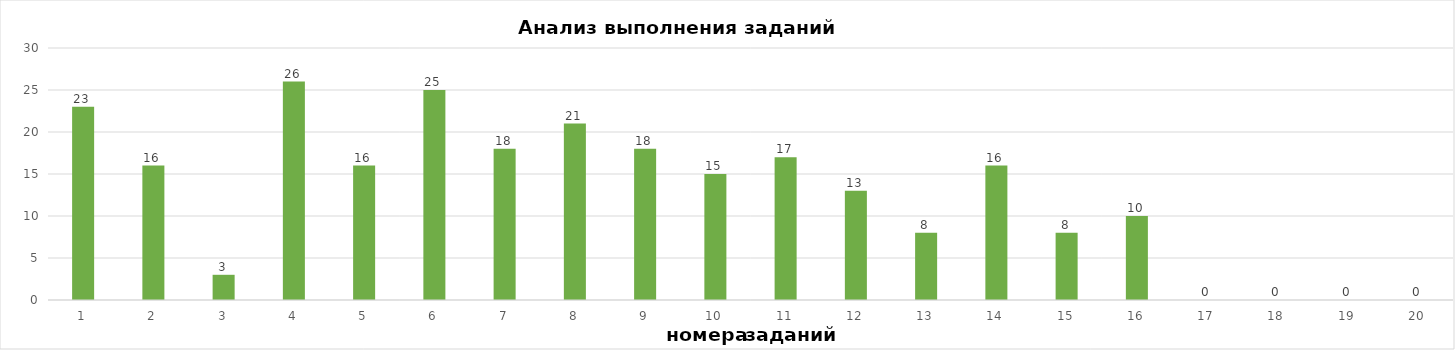
| Category | задания |
|---|---|
| 1.0 | 23 |
| 2.0 | 16 |
| 3.0 | 3 |
| 4.0 | 26 |
| 5.0 | 16 |
| 6.0 | 25 |
| 7.0 | 18 |
| 8.0 | 21 |
| 9.0 | 18 |
| 10.0 | 15 |
| 11.0 | 17 |
| 12.0 | 13 |
| 13.0 | 8 |
| 14.0 | 16 |
| 15.0 | 8 |
| 16.0 | 10 |
| 17.0 | 0 |
| 18.0 | 0 |
| 19.0 | 0 |
| 20.0 | 0 |